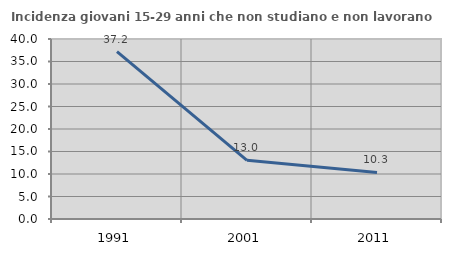
| Category | Incidenza giovani 15-29 anni che non studiano e non lavorano  |
|---|---|
| 1991.0 | 37.209 |
| 2001.0 | 13.043 |
| 2011.0 | 10.345 |